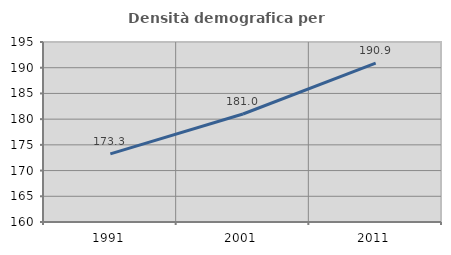
| Category | Densità demografica |
|---|---|
| 1991.0 | 173.251 |
| 2001.0 | 181.004 |
| 2011.0 | 190.877 |